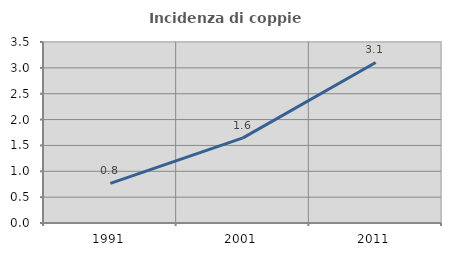
| Category | Incidenza di coppie miste |
|---|---|
| 1991.0 | 0.767 |
| 2001.0 | 1.647 |
| 2011.0 | 3.104 |